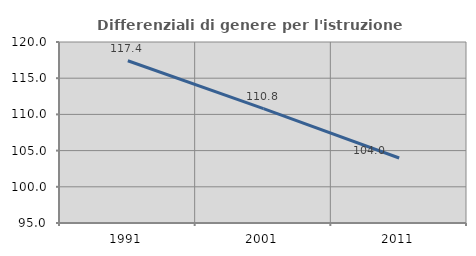
| Category | Differenziali di genere per l'istruzione superiore |
|---|---|
| 1991.0 | 117.414 |
| 2001.0 | 110.803 |
| 2011.0 | 103.98 |